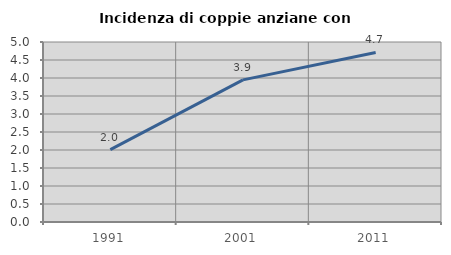
| Category | Incidenza di coppie anziane con figli |
|---|---|
| 1991.0 | 2.009 |
| 2001.0 | 3.949 |
| 2011.0 | 4.711 |